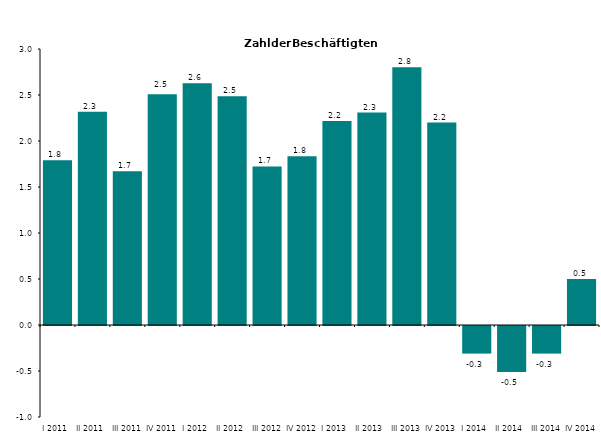
| Category | Series 0 |
|---|---|
| I 2011 | 1.79 |
| II 2011 | 2.319 |
| III 2011 | 1.672 |
| IV 2011 | 2.509 |
| I 2012 | 2.627 |
| II 2012 | 2.487 |
| III 2012 | 1.724 |
| IV 2012 | 1.834 |
| I 2013 | 2.218 |
| II 2013 | 2.309 |
| III 2013 | 2.802 |
| IV 2013 | 2.2 |
| I 2014 | -0.3 |
| II 2014 | -0.5 |
| III 2014 | -0.3 |
| IV 2014 | 0.5 |